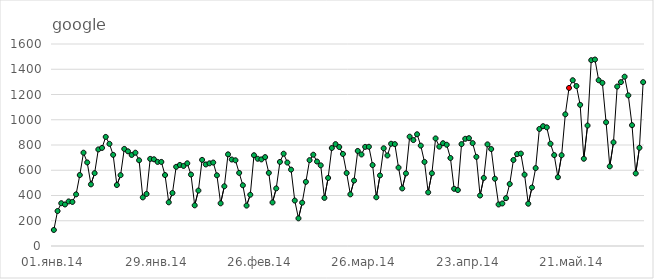
| Category | Итог |
|---|---|
| 01.янв.14 | 127 |
| 02.янв.14 | 277 |
| 03.янв.14 | 339 |
| 04.янв.14 | 329 |
| 05.янв.14 | 353 |
| 06.янв.14 | 349 |
| 07.янв.14 | 409 |
| 08.янв.14 | 562 |
| 09.янв.14 | 739 |
| 10.янв.14 | 662 |
| 11.янв.14 | 488 |
| 12.янв.14 | 577 |
| 13.янв.14 | 765 |
| 14.янв.14 | 777 |
| 15.янв.14 | 864 |
| 16.янв.14 | 809 |
| 17.янв.14 | 722 |
| 18.янв.14 | 483 |
| 19.янв.14 | 561 |
| 20.янв.14 | 769 |
| 21.янв.14 | 750 |
| 22.янв.14 | 721 |
| 23.янв.14 | 739 |
| 24.янв.14 | 679 |
| 25.янв.14 | 385 |
| 26.янв.14 | 412 |
| 27.янв.14 | 690 |
| 28.янв.14 | 687 |
| 29.янв.14 | 666 |
| 30.янв.14 | 666 |
| 31.янв.14 | 562 |
| 01.фев.14 | 346 |
| 02.фев.14 | 420 |
| 03.фев.14 | 627 |
| 04.фев.14 | 642 |
| 05.фев.14 | 634 |
| 06.фев.14 | 655 |
| 07.фев.14 | 566 |
| 08.фев.14 | 322 |
| 09.фев.14 | 439 |
| 10.фев.14 | 682 |
| 11.фев.14 | 646 |
| 12.фев.14 | 655 |
| 13.фев.14 | 661 |
| 14.фев.14 | 560 |
| 15.фев.14 | 338 |
| 16.фев.14 | 473 |
| 17.фев.14 | 726 |
| 18.фев.14 | 685 |
| 19.фев.14 | 679 |
| 20.фев.14 | 579 |
| 21.фев.14 | 481 |
| 22.фев.14 | 320 |
| 23.фев.14 | 406 |
| 24.фев.14 | 719 |
| 25.фев.14 | 691 |
| 26.фев.14 | 686 |
| 27.фев.14 | 704 |
| 28.фев.14 | 579 |
| 01.мар.14 | 345 |
| 02.мар.14 | 456 |
| 03.мар.14 | 666 |
| 04.мар.14 | 731 |
| 05.мар.14 | 661 |
| 06.мар.14 | 605 |
| 07.мар.14 | 360 |
| 08.мар.14 | 219 |
| 09.мар.14 | 343 |
| 10.мар.14 | 508 |
| 11.мар.14 | 680 |
| 12.мар.14 | 723 |
| 13.мар.14 | 669 |
| 14.мар.14 | 639 |
| 15.мар.14 | 381 |
| 16.мар.14 | 539 |
| 17.мар.14 | 776 |
| 18.мар.14 | 807 |
| 19.мар.14 | 784 |
| 20.мар.14 | 729 |
| 21.мар.14 | 578 |
| 22.мар.14 | 409 |
| 23.мар.14 | 518 |
| 24.мар.14 | 753 |
| 25.мар.14 | 725 |
| 26.мар.14 | 785 |
| 27.мар.14 | 786 |
| 28.мар.14 | 641 |
| 29.мар.14 | 386 |
| 30.мар.14 | 559 |
| 31.мар.14 | 774 |
| 01.апр.14 | 717 |
| 02.апр.14 | 810 |
| 03.апр.14 | 807 |
| 04.апр.14 | 621 |
| 05.апр.14 | 456 |
| 06.апр.14 | 575 |
| 07.апр.14 | 866 |
| 08.апр.14 | 839 |
| 09.апр.14 | 885 |
| 10.апр.14 | 795 |
| 11.апр.14 | 666 |
| 12.апр.14 | 425 |
| 13.апр.14 | 576 |
| 14.апр.14 | 852 |
| 15.апр.14 | 787 |
| 16.апр.14 | 814 |
| 17.апр.14 | 802 |
| 18.апр.14 | 697 |
| 19.апр.14 | 453 |
| 20.апр.14 | 443 |
| 21.апр.14 | 807 |
| 22.апр.14 | 849 |
| 23.апр.14 | 854 |
| 24.апр.14 | 815 |
| 25.апр.14 | 706 |
| 26.апр.14 | 400 |
| 27.апр.14 | 539 |
| 28.апр.14 | 805 |
| 29.апр.14 | 768 |
| 30.апр.14 | 533 |
| 01.май.14 | 329 |
| 02.май.14 | 337 |
| 03.май.14 | 379 |
| 04.май.14 | 491 |
| 05.май.14 | 681 |
| 06.май.14 | 728 |
| 07.май.14 | 732 |
| 08.май.14 | 565 |
| 09.май.14 | 335 |
| 10.май.14 | 463 |
| 11.май.14 | 617 |
| 12.май.14 | 927 |
| 13.май.14 | 949 |
| 14.май.14 | 940 |
| 15.май.14 | 810 |
| 16.май.14 | 720 |
| 17.май.14 | 545 |
| 18.май.14 | 719 |
| 19.май.14 | 1043 |
| 20.май.14 | 1252 |
| 21.май.14 | 1313 |
| 22.май.14 | 1267 |
| 23.май.14 | 1118 |
| 24.май.14 | 691 |
| 25.май.14 | 954 |
| 26.май.14 | 1472 |
| 27.май.14 | 1477 |
| 28.май.14 | 1313 |
| 29.май.14 | 1292 |
| 30.май.14 | 980 |
| 31.май.14 | 631 |
| 01.июн.14 | 821 |
| 02.июн.14 | 1263 |
| 03.июн.14 | 1298 |
| 04.июн.14 | 1341 |
| 05.июн.14 | 1193 |
| 06.июн.14 | 957 |
| 07.июн.14 | 575 |
| 08.июн.14 | 778 |
| 09.июн.14 | 1298 |